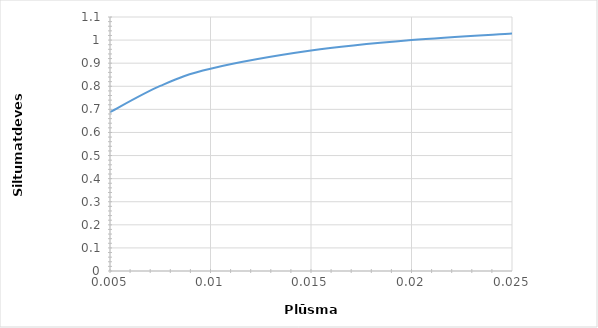
| Category | effektfaktor |
|---|---|
| 0.005 | 0.688 |
| 0.0075 | 0.802 |
| 0.01 | 0.876 |
| 0.015 | 0.954 |
| 0.02 | 1 |
| 0.025 | 1.028 |